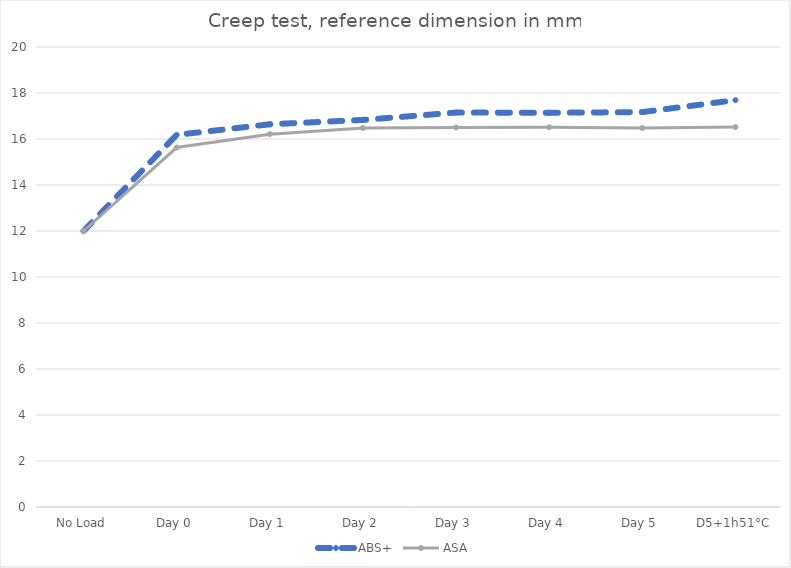
| Category | ABS+ | ASA |
|---|---|---|
| No Load | 12 | 12 |
| Day 0 | 16.18 | 15.63 |
| Day 1 | 16.64 | 16.21 |
| Day 2 | 16.83 | 16.48 |
| Day 3 | 17.15 | 16.5 |
| Day 4 | 17.14 | 16.51 |
| Day 5 | 17.17 | 16.48 |
| D5+1h51°C | 17.69 | 16.52 |